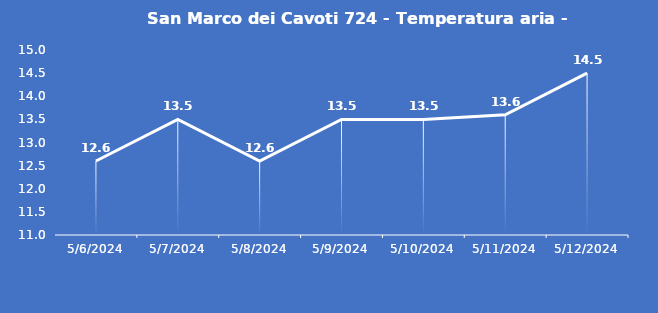
| Category | San Marco dei Cavoti 724 - Temperatura aria - Grezzo (°C) |
|---|---|
| 5/6/24 | 12.6 |
| 5/7/24 | 13.5 |
| 5/8/24 | 12.6 |
| 5/9/24 | 13.5 |
| 5/10/24 | 13.5 |
| 5/11/24 | 13.6 |
| 5/12/24 | 14.5 |